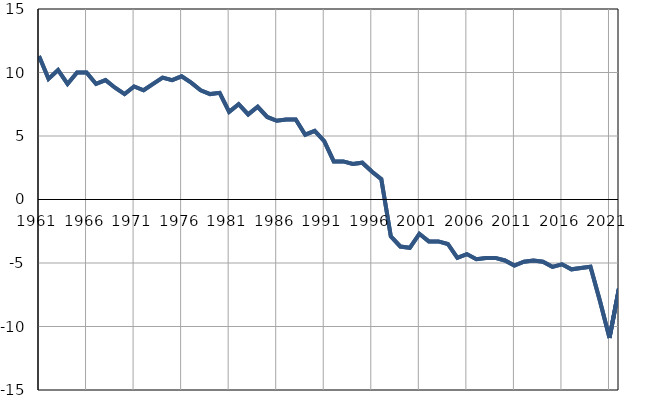
| Category |  РЕПУБЛИКА СРБИЈА |  Република Србија |
|---|---|---|
| 1961.0 | 11.3 | 11.3 |
| 1962.0 | 9.5 | 9.5 |
| 1963.0 | 10.2 | 10.2 |
| 1964.0 | 9.1 | 9.1 |
| 1965.0 | 10 | 10 |
| 1966.0 | 10 | 10 |
| 1967.0 | 9.1 | 9.1 |
| 1968.0 | 9.4 | 9.4 |
| 1969.0 | 8.8 | 8.8 |
| 1970.0 | 8.3 | 8.3 |
| 1971.0 | 8.9 | 8.9 |
| 1972.0 | 8.6 | 8.6 |
| 1973.0 | 9.1 | 9.1 |
| 1974.0 | 9.6 | 9.6 |
| 1975.0 | 9.4 | 9.4 |
| 1976.0 | 9.7 | 9.7 |
| 1977.0 | 9.2 | 9.2 |
| 1978.0 | 8.6 | 8.6 |
| 1979.0 | 8.3 | 8.3 |
| 1980.0 | 8.4 | 8.4 |
| 1981.0 | 6.9 | 6.9 |
| 1982.0 | 7.5 | 7.5 |
| 1983.0 | 6.7 | 6.7 |
| 1984.0 | 7.3 | 7.3 |
| 1985.0 | 6.5 | 6.5 |
| 1986.0 | 6.2 | 6.2 |
| 1987.0 | 6.3 | 6.3 |
| 1988.0 | 6.3 | 6.3 |
| 1989.0 | 5.1 | 5.1 |
| 1990.0 | 5.4 | 5.4 |
| 1991.0 | 4.6 | 4.6 |
| 1992.0 | 3 | 3 |
| 1993.0 | 3 | 3 |
| 1994.0 | 2.8 | 2.8 |
| 1995.0 | 2.9 | 2.9 |
| 1996.0 | 2.2 | 2.2 |
| 1997.0 | 1.6 | 1.6 |
| 1998.0 | -2.9 | -2.9 |
| 1999.0 | -3.7 | -3.7 |
| 2000.0 | -3.8 | -3.8 |
| 2001.0 | -2.7 | -2.7 |
| 2002.0 | -3.3 | -3.3 |
| 2003.0 | -3.3 | -3.3 |
| 2004.0 | -3.5 | -3.5 |
| 2005.0 | -4.6 | -4.6 |
| 2006.0 | -4.3 | -4.3 |
| 2007.0 | -4.7 | -4.7 |
| 2008.0 | -4.6 | -4.6 |
| 2009.0 | -4.6 | -4.6 |
| 2010.0 | -4.8 | -4.8 |
| 2011.0 | -5.2 | -5.2 |
| 2012.0 | -4.9 | -4.9 |
| 2013.0 | -4.8 | -4.8 |
| 2014.0 | -4.9 | -4.9 |
| 2015.0 | -5.3 | -5.3 |
| 2016.0 | -5.1 | -5.1 |
| 2017.0 | -5.5 | -5.5 |
| 2018.0 | -5.4 | -5.4 |
| 2019.0 | -5.3 | -5.3 |
| 2020.0 | -8 | -8 |
| 2021.0 | -10.9 | -10.9 |
| 2022.0 | -7 | -7 |